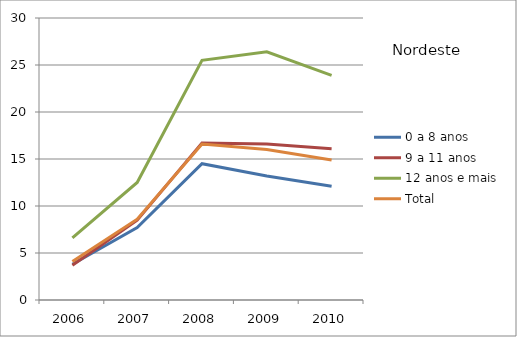
| Category | 0 a 8 anos | 9 a 11 anos | 12 anos e mais | Total |
|---|---|---|---|---|
| 2006.0 | 3.8 | 3.7 | 6.6 | 4.1 |
| 2007.0 | 7.7 | 8.5 | 12.5 | 8.6 |
| 2008.0 | 14.5 | 16.7 | 25.5 | 16.6 |
| 2009.0 | 13.2 | 16.6 | 26.4 | 16 |
| 2010.0 | 12.1 | 16.1 | 23.9 | 14.9 |